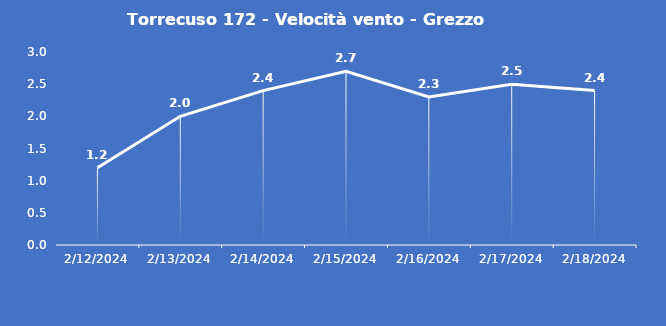
| Category | Torrecuso 172 - Velocità vento - Grezzo (m/s) |
|---|---|
| 2/12/24 | 1.2 |
| 2/13/24 | 2 |
| 2/14/24 | 2.4 |
| 2/15/24 | 2.7 |
| 2/16/24 | 2.3 |
| 2/17/24 | 2.5 |
| 2/18/24 | 2.4 |